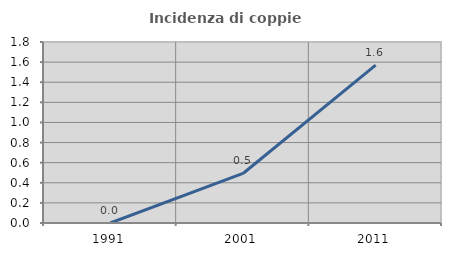
| Category | Incidenza di coppie miste |
|---|---|
| 1991.0 | 0 |
| 2001.0 | 0.493 |
| 2011.0 | 1.571 |